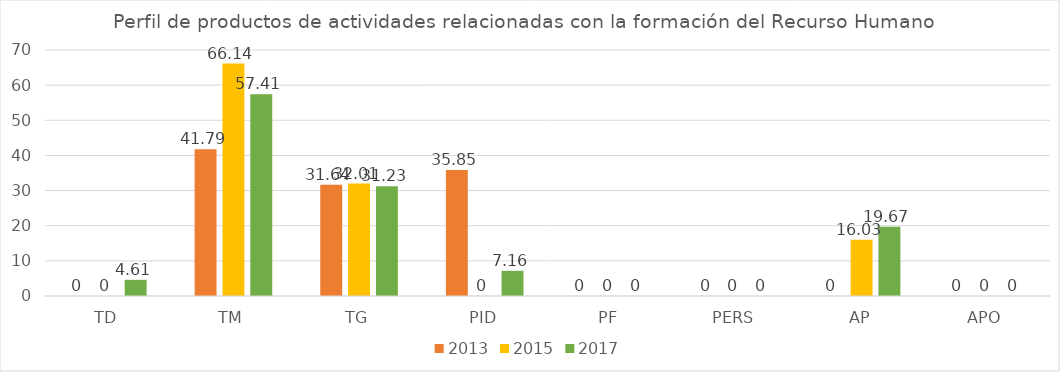
| Category | 2013 | 2015 | 2017 |
|---|---|---|---|
| TD | 0 | 0 | 4.61 |
| TM | 41.79 | 66.14 | 57.41 |
| TG | 31.64 | 32.01 | 31.23 |
| PID | 35.85 | 0 | 7.16 |
| PF | 0 | 0 | 0 |
| PERS | 0 | 0 | 0 |
| AP | 0 | 16.03 | 19.67 |
| APO | 0 | 0 | 0 |